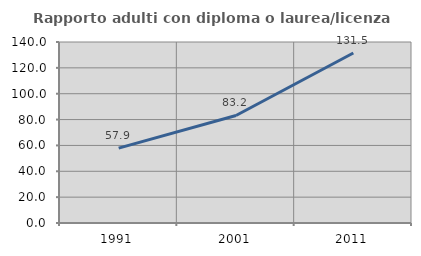
| Category | Rapporto adulti con diploma o laurea/licenza media  |
|---|---|
| 1991.0 | 57.895 |
| 2001.0 | 83.168 |
| 2011.0 | 131.522 |